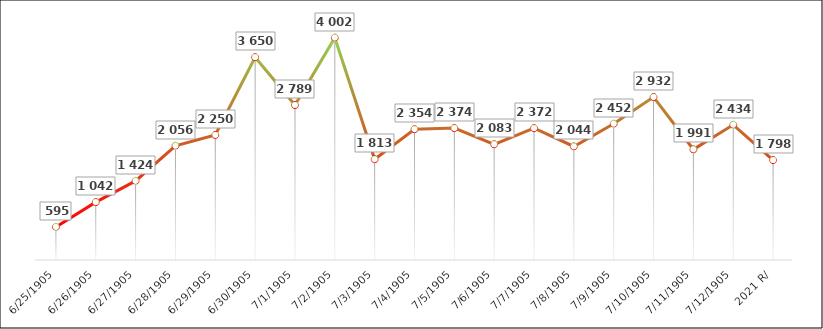
| Category | Valor bruto de producción |
|---|---|
| 2003 | 595 |
| 2004 | 1042 |
| 2005 | 1424 |
| 2006 | 2056 |
| 2007 | 2250 |
| 2008 | 3650 |
| 2009 | 2789 |
| 2010 | 4002 |
| 2011 | 1813 |
| 2012 | 2354 |
| 2013 | 2374 |
| 2014 | 2083 |
| 2015 | 2372 |
| 2016 | 2044 |
| 2017 | 2452 |
| 2018 | 2932 |
| 2019 | 1991 |
| 2020 | 2434 |
| 2021 R/ | 1798 |